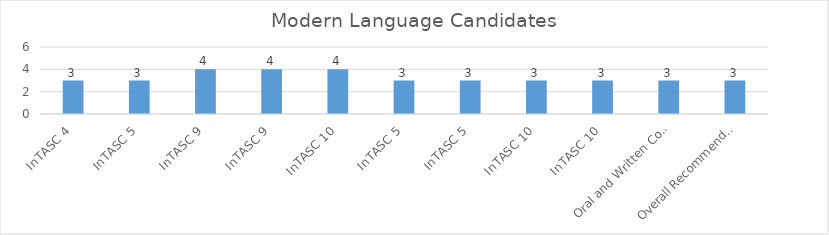
| Category | Modern Lang |
|---|---|
| InTASC 4 | 3 |
| InTASC 5 | 3 |
| InTASC 9 | 4 |
| InTASC 9 | 4 |
| InTASC 10 | 4 |
| InTASC 5 | 3 |
| InTASC 5 | 3 |
| InTASC 10 | 3 |
| InTASC 10 | 3 |
| Oral and Written Communication | 3 |
| Overall Recommendation | 3 |